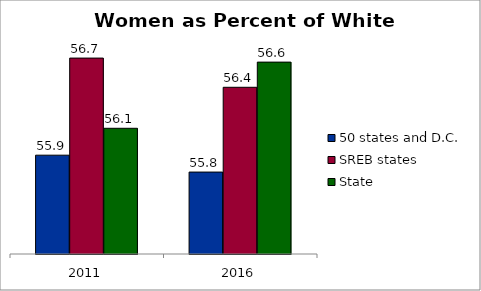
| Category | 50 states and D.C. | SREB states | State |
|---|---|---|---|
| 2011.0 | 55.939 | 56.665 | 56.14 |
| 2016.0 | 55.813 | 56.446 | 56.635 |